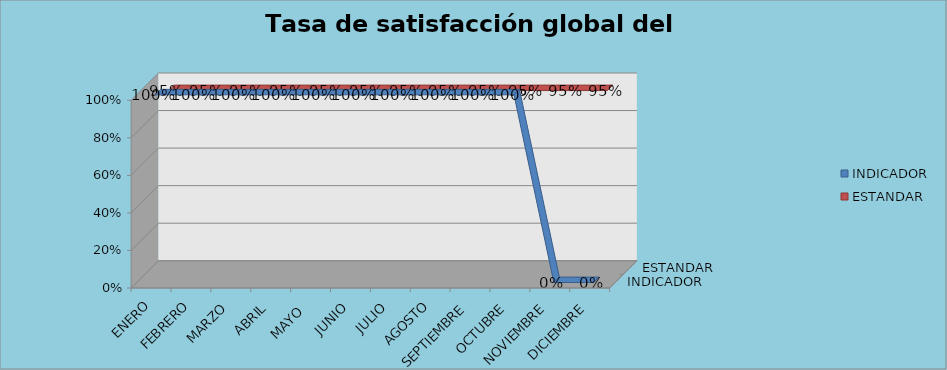
| Category | INDICADOR | ESTANDAR |
|---|---|---|
| ENERO | 1 | 0.95 |
| FEBRERO | 1 | 0.95 |
| MARZO | 1 | 0.95 |
| ABRIL | 1 | 0.95 |
| MAYO  | 1 | 0.95 |
| JUNIO | 1 | 0.95 |
| JULIO | 1 | 0.95 |
| AGOSTO | 1 | 0.95 |
| SEPTIEMBRE | 1 | 0.95 |
| OCTUBRE | 1 | 0.95 |
| NOVIEMBRE | 0 | 0.95 |
| DICIEMBRE | 0 | 0.95 |